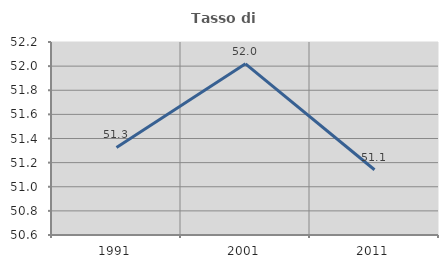
| Category | Tasso di occupazione   |
|---|---|
| 1991.0 | 51.326 |
| 2001.0 | 52.019 |
| 2011.0 | 51.141 |